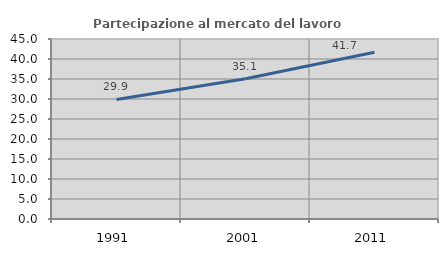
| Category | Partecipazione al mercato del lavoro  femminile |
|---|---|
| 1991.0 | 29.9 |
| 2001.0 | 35.077 |
| 2011.0 | 41.679 |